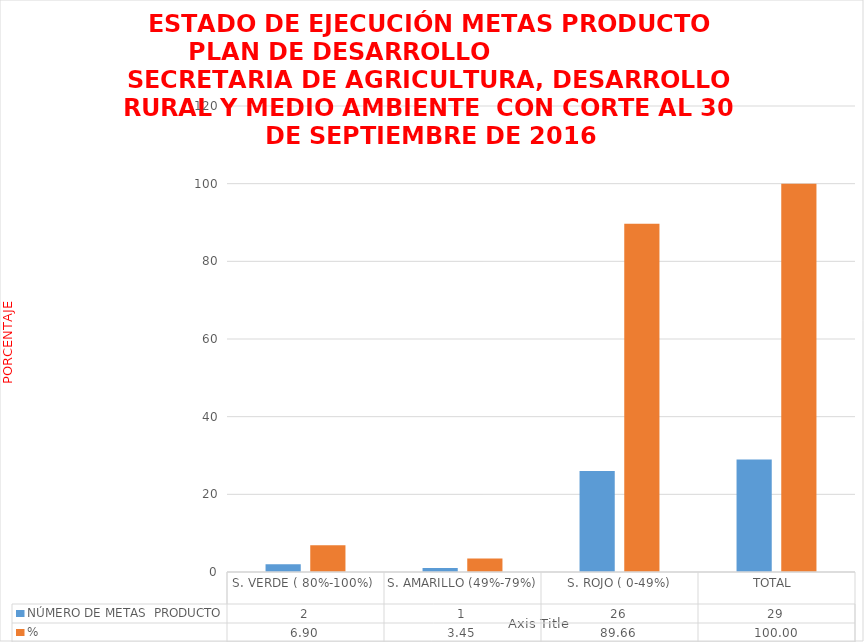
| Category | NÚMERO DE METAS  PRODUCTO  | % |
|---|---|---|
| S. VERDE ( 80%-100%)  | 2 | 6.897 |
| S. AMARILLO (49%-79%) | 1 | 3.448 |
| S. ROJO ( 0-49%) | 26 | 89.655 |
| TOTAL  | 29 | 100 |